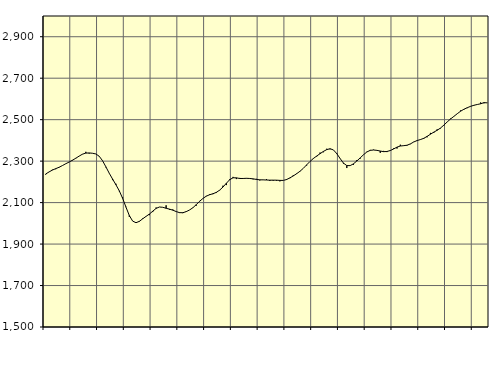
| Category | Piggar | Series 1 |
|---|---|---|
| nan | 2235.2 | 2238.07 |
| 87.0 | 2248 | 2247.77 |
| 87.0 | 2258.7 | 2256.79 |
| 87.0 | 2261.1 | 2263.73 |
| nan | 2269.2 | 2270.29 |
| 88.0 | 2278.3 | 2278.61 |
| 88.0 | 2286.8 | 2287.31 |
| 88.0 | 2295.1 | 2295.56 |
| nan | 2302.8 | 2304.44 |
| 89.0 | 2315.4 | 2313.88 |
| 89.0 | 2324.6 | 2324.27 |
| 89.0 | 2334.2 | 2333.53 |
| nan | 2344.9 | 2338.76 |
| 90.0 | 2336.5 | 2339.51 |
| 90.0 | 2337.7 | 2338.01 |
| 90.0 | 2334.8 | 2334.57 |
| nan | 2324.6 | 2323.56 |
| 91.0 | 2302.7 | 2301.9 |
| 91.0 | 2269.9 | 2272.43 |
| 91.0 | 2240.9 | 2241.71 |
| nan | 2208.5 | 2213.39 |
| 92.0 | 2190.7 | 2186.06 |
| 92.0 | 2154.6 | 2156.76 |
| 92.0 | 2125.3 | 2120.67 |
| nan | 2079.9 | 2078.05 |
| 93.0 | 2031 | 2037.69 |
| 93.0 | 2010.7 | 2010.76 |
| 93.0 | 2003.6 | 2002.97 |
| nan | 2011.4 | 2009.57 |
| 94.0 | 2024.1 | 2021.88 |
| 94.0 | 2034.2 | 2033.52 |
| 94.0 | 2039.3 | 2044.78 |
| nan | 2054.3 | 2058.54 |
| 95.0 | 2076.3 | 2071.97 |
| 95.0 | 2078.9 | 2078.75 |
| 95.0 | 2077.3 | 2077.29 |
| nan | 2086.9 | 2072.66 |
| 96.0 | 2065.4 | 2068.48 |
| 96.0 | 2067 | 2063.51 |
| 96.0 | 2057.8 | 2056.82 |
| nan | 2049.8 | 2051.5 |
| 97.0 | 2049.3 | 2051.26 |
| 97.0 | 2058.5 | 2056.44 |
| 97.0 | 2064.6 | 2064.35 |
| nan | 2074.3 | 2075.24 |
| 98.0 | 2085 | 2090.03 |
| 98.0 | 2108 | 2106.24 |
| 98.0 | 2119.9 | 2119.99 |
| nan | 2132.3 | 2130.99 |
| 99.0 | 2140.6 | 2137.99 |
| 99.0 | 2140.8 | 2142.72 |
| 99.0 | 2146.2 | 2149.23 |
| nan | 2158.8 | 2160.11 |
| 0.0 | 2181.5 | 2175.11 |
| 0.0 | 2184.5 | 2193.18 |
| 0.0 | 2213.5 | 2210.47 |
| nan | 2224 | 2219.69 |
| 1.0 | 2213.5 | 2219.41 |
| 1.0 | 2219 | 2216.24 |
| 1.0 | 2216.7 | 2216.34 |
| nan | 2218.3 | 2217.19 |
| 2.0 | 2217.2 | 2216.32 |
| 2.0 | 2212.2 | 2214.56 |
| 2.0 | 2214.5 | 2211.74 |
| nan | 2206.9 | 2209.84 |
| 3.0 | 2210.1 | 2209.61 |
| 3.0 | 2213 | 2208.93 |
| 3.0 | 2204.3 | 2208.23 |
| nan | 2205.4 | 2208.25 |
| 4.0 | 2205.4 | 2208.12 |
| 4.0 | 2202.5 | 2207.12 |
| 4.0 | 2206.9 | 2206.9 |
| nan | 2213.6 | 2211.21 |
| 5.0 | 2217.8 | 2219.19 |
| 5.0 | 2232.2 | 2228.64 |
| 5.0 | 2240.9 | 2239.33 |
| nan | 2252.1 | 2251.02 |
| 6.0 | 2265 | 2265.19 |
| 6.0 | 2278.8 | 2282.04 |
| 6.0 | 2298.2 | 2298.35 |
| nan | 2311 | 2312.62 |
| 7.0 | 2322.2 | 2324.66 |
| 7.0 | 2341.2 | 2335.86 |
| 7.0 | 2342.8 | 2346.71 |
| nan | 2359.7 | 2355.52 |
| 8.0 | 2357.1 | 2359.75 |
| 8.0 | 2354.1 | 2354.13 |
| 8.0 | 2339.2 | 2336.35 |
| nan | 2311.8 | 2312.71 |
| 9.0 | 2287.5 | 2290.52 |
| 9.0 | 2266.7 | 2278.63 |
| 9.0 | 2278.2 | 2278.28 |
| nan | 2282.3 | 2287.14 |
| 10.0 | 2305 | 2300.58 |
| 10.0 | 2312.3 | 2315.52 |
| 10.0 | 2330.4 | 2330.89 |
| nan | 2345.2 | 2344.21 |
| 11.0 | 2354 | 2352.03 |
| 11.0 | 2355.2 | 2353.64 |
| 11.0 | 2351.3 | 2351.99 |
| nan | 2340.1 | 2348.71 |
| 12.0 | 2349.4 | 2345.75 |
| 12.0 | 2343.6 | 2346.48 |
| 12.0 | 2352.7 | 2351.11 |
| nan | 2361.9 | 2358.79 |
| 13.0 | 2360.7 | 2367.5 |
| 13.0 | 2379.2 | 2372.91 |
| 13.0 | 2375.5 | 2374.61 |
| nan | 2375 | 2376.63 |
| 14.0 | 2381.9 | 2383.09 |
| 14.0 | 2392.9 | 2392.26 |
| 14.0 | 2398.2 | 2399.23 |
| nan | 2404.9 | 2403.98 |
| 15.0 | 2407.2 | 2410.05 |
| 15.0 | 2415.1 | 2419.28 |
| 15.0 | 2436.2 | 2429.86 |
| nan | 2436.1 | 2439.89 |
| 16.0 | 2453.3 | 2448.77 |
| 16.0 | 2457.8 | 2459.62 |
| 16.0 | 2471.3 | 2473.56 |
| nan | 2488.7 | 2488.94 |
| 17.0 | 2505.1 | 2503.15 |
| 17.0 | 2515.2 | 2515.85 |
| 17.0 | 2528.3 | 2528.52 |
| nan | 2544.3 | 2540.67 |
| 18.0 | 2548.3 | 2550.17 |
| 18.0 | 2555.6 | 2557.7 |
| 18.0 | 2563.3 | 2564.29 |
| nan | 2570.3 | 2569.45 |
| 19.0 | 2572.9 | 2573.21 |
| 19.0 | 2582.9 | 2576.58 |
| 19.0 | 2579.1 | 2582.18 |
| nan | 2581.4 | 2581.04 |